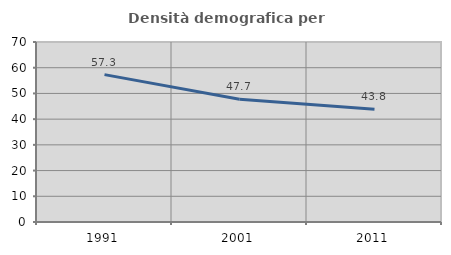
| Category | Densità demografica |
|---|---|
| 1991.0 | 57.308 |
| 2001.0 | 47.7 |
| 2011.0 | 43.828 |